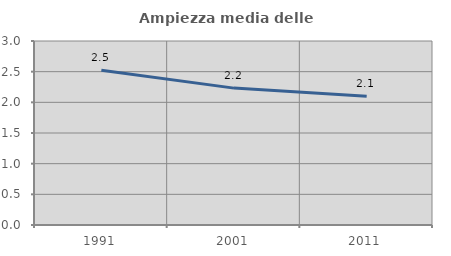
| Category | Ampiezza media delle famiglie |
|---|---|
| 1991.0 | 2.524 |
| 2001.0 | 2.232 |
| 2011.0 | 2.098 |